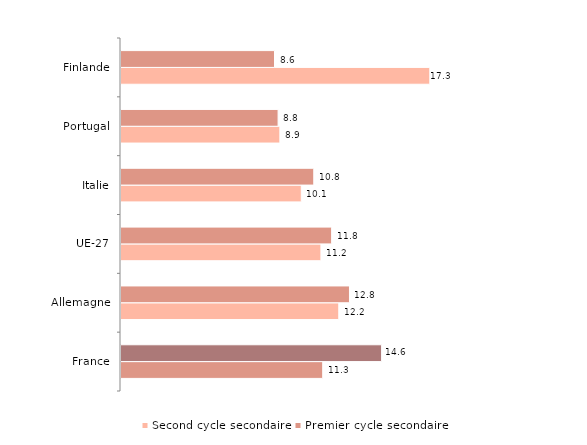
| Category | Second cycle secondaire | Premier cycle secondaire |
|---|---|---|
| France | 11.3 | 14.6 |
| Allemagne | 12.2 | 12.8 |
| UE-27 | 11.2 | 11.8 |
| Italie | 10.1 | 10.8 |
| Portugal | 8.9 | 8.8 |
| Finlande | 17.3 | 8.6 |